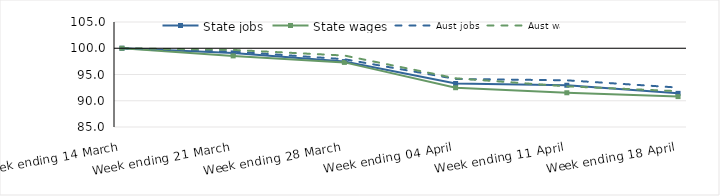
| Category | State jobs | State wages | Aust jobs | Aust wages |
|---|---|---|---|---|
| 2020-03-14 | 100 | 100 | 100 | 100 |
| 2020-03-21 | 99.115 | 98.544 | 99.358 | 99.683 |
| 2020-03-28 | 97.462 | 97.308 | 97.912 | 98.613 |
| 2020-04-04 | 93.287 | 92.483 | 94.152 | 94.278 |
| 2020-04-11 | 92.953 | 91.522 | 93.892 | 92.743 |
| 2020-04-18 | 91.408 | 90.792 | 92.512 | 91.82 |